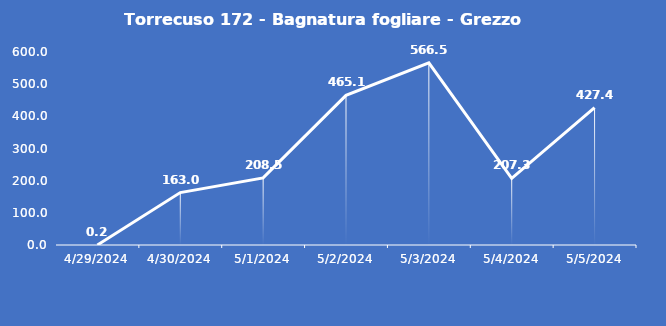
| Category | Torrecuso 172 - Bagnatura fogliare - Grezzo (min) |
|---|---|
| 4/29/24 | 0.2 |
| 4/30/24 | 163 |
| 5/1/24 | 208.5 |
| 5/2/24 | 465.1 |
| 5/3/24 | 566.5 |
| 5/4/24 | 207.3 |
| 5/5/24 | 427.4 |